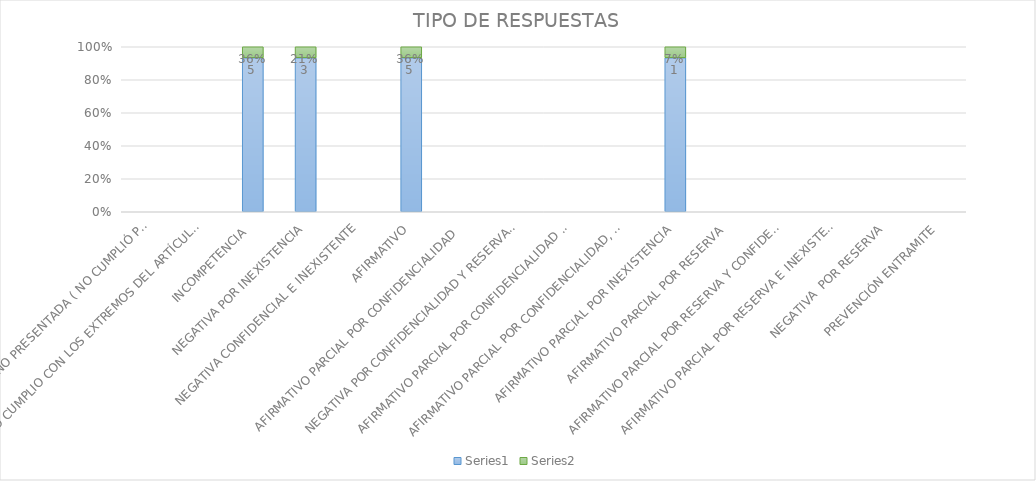
| Category | Series 4 | Series 5 |
|---|---|---|
| SE TIENE POR NO PRESENTADA ( NO CUMPLIÓ PREVENCIÓN) | 0 | 0 |
| NO CUMPLIO CON LOS EXTREMOS DEL ARTÍCULO 79 (REQUISITOS) | 0 | 0 |
| INCOMPETENCIA  | 5 | 0.357 |
| NEGATIVA POR INEXISTENCIA | 3 | 0.214 |
| NEGATIVA CONFIDENCIAL E INEXISTENTE | 0 | 0 |
| AFIRMATIVO | 5 | 0.357 |
| AFIRMATIVO PARCIAL POR CONFIDENCIALIDAD  | 0 | 0 |
| NEGATIVA POR CONFIDENCIALIDAD Y RESERVADA | 0 | 0 |
| AFIRMATIVO PARCIAL POR CONFIDENCIALIDAD E INEXISTENCIA | 0 | 0 |
| AFIRMATIVO PARCIAL POR CONFIDENCIALIDAD, RESERVA E INEXISTENCIA | 0 | 0 |
| AFIRMATIVO PARCIAL POR INEXISTENCIA | 1 | 0.071 |
| AFIRMATIVO PARCIAL POR RESERVA | 0 | 0 |
| AFIRMATIVO PARCIAL POR RESERVA Y CONFIDENCIALIDAD | 0 | 0 |
| AFIRMATIVO PARCIAL POR RESERVA E INEXISTENCIA | 0 | 0 |
| NEGATIVA  POR RESERVA | 0 | 0 |
| PREVENCIÓN ENTRAMITE | 0 | 0 |